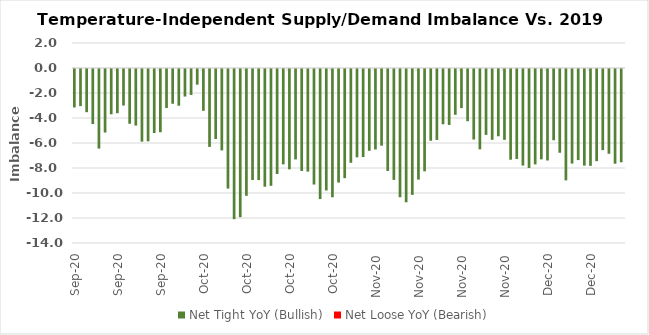
| Category | Net Tight YoY (Bullish) | Net Loose YoY (Bearish) |
|---|---|---|
| 2020-09-15 | -3.076 | 0 |
| 2020-09-16 | -2.969 | 0 |
| 2020-09-17 | -3.454 | 0 |
| 2020-09-18 | -4.405 | 0 |
| 2020-09-19 | -6.368 | 0 |
| 2020-09-20 | -5.083 | 0 |
| 2020-09-21 | -3.624 | 0 |
| 2020-09-22 | -3.538 | 0 |
| 2020-09-23 | -2.925 | 0 |
| 2020-09-24 | -4.381 | 0 |
| 2020-09-25 | -4.525 | 0 |
| 2020-09-26 | -5.811 | 0 |
| 2020-09-27 | -5.785 | 0 |
| 2020-09-28 | -5.119 | 0 |
| 2020-09-29 | -5.059 | 0 |
| 2020-09-30 | -3.123 | 0 |
| 2020-10-01 | -2.78 | 0 |
| 2020-10-02 | -2.939 | 0 |
| 2020-10-03 | -2.204 | 0 |
| 2020-10-04 | -2.075 | 0 |
| 2020-10-05 | -1.253 | 0 |
| 2020-10-06 | -3.344 | 0 |
| 2020-10-07 | -6.232 | 0 |
| 2020-10-08 | -5.6 | 0 |
| 2020-10-09 | -6.513 | 0 |
| 2020-10-10 | -9.566 | 0 |
| 2020-10-11 | -12.014 | 0 |
| 2020-10-12 | -11.855 | 0 |
| 2020-10-13 | -10.144 | 0 |
| 2020-10-14 | -8.879 | 0 |
| 2020-10-15 | -8.887 | 0 |
| 2020-10-16 | -9.417 | 0 |
| 2020-10-17 | -9.346 | 0 |
| 2020-10-18 | -8.402 | 0 |
| 2020-10-19 | -7.631 | 0 |
| 2020-10-20 | -8.027 | 0 |
| 2020-10-21 | -7.233 | 0 |
| 2020-10-22 | -8.157 | 0 |
| 2020-10-23 | -8.207 | 0 |
| 2020-10-24 | -9.242 | 0 |
| 2020-10-25 | -10.404 | 0 |
| 2020-10-26 | -9.718 | 0 |
| 2020-10-27 | -10.261 | 0 |
| 2020-10-28 | -9.085 | 0 |
| 2020-10-29 | -8.733 | 0 |
| 2020-10-30 | -7.505 | 0 |
| 2020-10-31 | -7.066 | 0 |
| 2020-11-01 | -7.046 | 0 |
| 2020-11-02 | -6.544 | 0 |
| 2020-11-03 | -6.436 | 0 |
| 2020-11-04 | -6.135 | 0 |
| 2020-11-05 | -8.157 | 0 |
| 2020-11-06 | -8.871 | 0 |
| 2020-11-07 | -10.259 | 0 |
| 2020-11-08 | -10.661 | 0 |
| 2020-11-09 | -10.069 | 0 |
| 2020-11-10 | -8.85 | 0 |
| 2020-11-11 | -8.185 | 0 |
| 2020-11-12 | -5.739 | 0 |
| 2020-11-13 | -5.676 | 0 |
| 2020-11-14 | -4.423 | 0 |
| 2020-11-15 | -4.476 | 0 |
| 2020-11-16 | -3.664 | 0 |
| 2020-11-17 | -3.131 | 0 |
| 2020-11-18 | -4.176 | 0 |
| 2020-11-19 | -5.641 | 0 |
| 2020-11-20 | -6.425 | 0 |
| 2020-11-21 | -5.272 | 0 |
| 2020-11-22 | -5.664 | 0 |
| 2020-11-23 | -5.381 | 0 |
| 2020-11-24 | -5.668 | 0 |
| 2020-11-25 | -7.257 | 0 |
| 2020-11-26 | -7.2 | 0 |
| 2020-11-27 | -7.724 | 0 |
| 2020-11-28 | -7.922 | 0 |
| 2020-11-29 | -7.632 | 0 |
| 2020-11-30 | -7.229 | 0 |
| 2020-12-01 | -7.32 | 0 |
| 2020-12-02 | -5.7 | 0 |
| 2020-12-03 | -6.701 | 0 |
| 2020-12-04 | -8.909 | 0 |
| 2020-12-05 | -7.565 | 0 |
| 2020-12-06 | -7.287 | 0 |
| 2020-12-07 | -7.73 | 0 |
| 2020-12-08 | -7.749 | 0 |
| 2020-12-09 | -7.372 | 0 |
| 2020-12-10 | -6.493 | 0 |
| 2020-12-11 | -6.783 | 0 |
| 2020-12-12 | -7.579 | 0 |
| 2020-12-13 | -7.462 | 0 |
| nan | 0 | 0 |